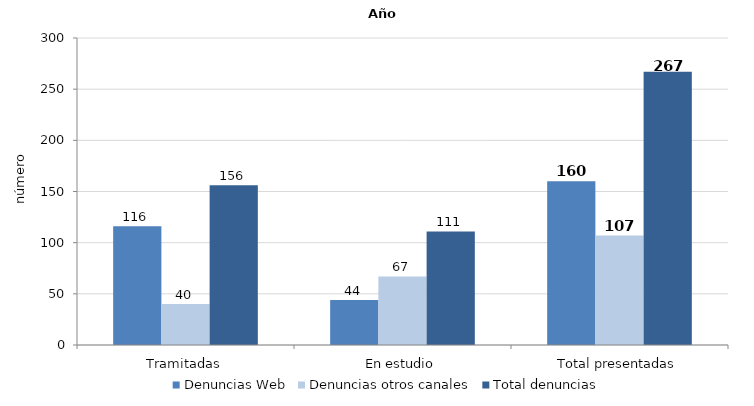
| Category | Denuncias Web | Denuncias otros canales | Total denuncias |
|---|---|---|---|
| Tramitadas | 116 | 40 | 156 |
| En estudio | 44 | 67 | 111 |
| Total presentadas | 160 | 107 | 267 |